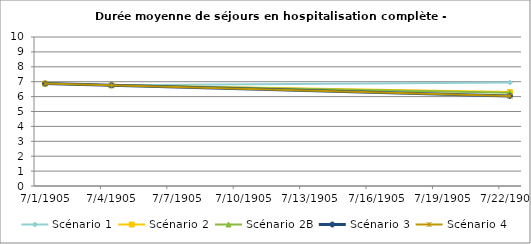
| Category | Scénario 1 | Scénario 2 | Scénario 2B | Scénario 3 | Scénario 4 |
|---|---|---|---|---|---|
| 2009.0 | 6.876 | 6.876 | 6.876 | 6.876 | 6.876 |
| 2012.0 | 6.764 | 6.764 | 6.764 | 6.764 | 6.764 |
| 2030.0 | 6.95 | 6.301 | 6.259 | 6.039 | 6.039 |